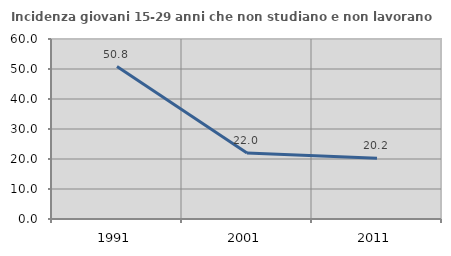
| Category | Incidenza giovani 15-29 anni che non studiano e non lavorano  |
|---|---|
| 1991.0 | 50.806 |
| 2001.0 | 21.968 |
| 2011.0 | 20.244 |